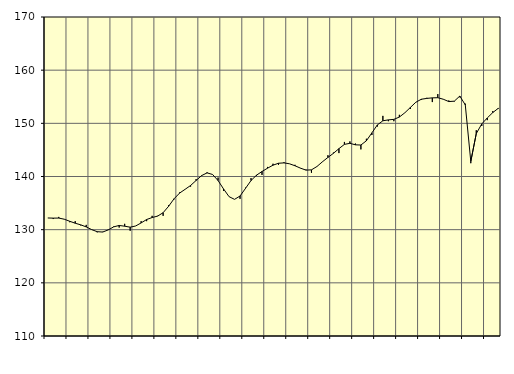
| Category | Piggar | Samtliga sysselsatta (inkl. sysselsatta utomlands)1 |
|---|---|---|
| nan | 132.2 | 132.2 |
| 1.0 | 132 | 132.17 |
| 1.0 | 132.4 | 132.18 |
| 1.0 | 132 | 131.97 |
| nan | 131.4 | 131.58 |
| 2.0 | 131.6 | 131.21 |
| 2.0 | 130.8 | 130.91 |
| 2.0 | 130.9 | 130.52 |
| nan | 130 | 130.01 |
| 3.0 | 129.5 | 129.62 |
| 3.0 | 129.6 | 129.55 |
| 3.0 | 130 | 129.95 |
| nan | 130.6 | 130.53 |
| 4.0 | 130.4 | 130.79 |
| 4.0 | 131.1 | 130.65 |
| 4.0 | 129.8 | 130.47 |
| nan | 130.7 | 130.69 |
| 5.0 | 131.6 | 131.27 |
| 5.0 | 131.6 | 131.91 |
| 5.0 | 132.6 | 132.28 |
| nan | 132.6 | 132.55 |
| 6.0 | 132.6 | 133.19 |
| 6.0 | 134.6 | 134.4 |
| 6.0 | 135.7 | 135.82 |
| nan | 137 | 136.88 |
| 7.0 | 137.6 | 137.59 |
| 7.0 | 138.1 | 138.31 |
| 7.0 | 139.5 | 139.25 |
| nan | 140.1 | 140.17 |
| 8.0 | 140.8 | 140.68 |
| 8.0 | 140.4 | 140.38 |
| 8.0 | 139.8 | 139.24 |
| nan | 137.3 | 137.66 |
| 9.0 | 136.2 | 136.21 |
| 9.0 | 135.7 | 135.7 |
| 9.0 | 135.8 | 136.33 |
| nan | 137.9 | 137.77 |
| 10.0 | 139.7 | 139.24 |
| 10.0 | 140.1 | 140.25 |
| 10.0 | 140.3 | 140.94 |
| nan | 141.8 | 141.56 |
| 11.0 | 142.4 | 142.13 |
| 11.0 | 142.2 | 142.49 |
| 11.0 | 142.7 | 142.56 |
| nan | 142.4 | 142.39 |
| 12.0 | 142.2 | 142.02 |
| 12.0 | 141.6 | 141.57 |
| 12.0 | 141.3 | 141.2 |
| nan | 140.7 | 141.25 |
| 13.0 | 141.9 | 141.88 |
| 13.0 | 142.8 | 142.77 |
| 13.0 | 144 | 143.59 |
| nan | 144.5 | 144.36 |
| 14.0 | 144.4 | 145.24 |
| 14.0 | 146.5 | 146.04 |
| 14.0 | 146.6 | 146.24 |
| nan | 146.2 | 145.96 |
| 15.0 | 145.1 | 145.92 |
| 15.0 | 147.1 | 146.72 |
| 15.0 | 147.8 | 148.21 |
| nan | 149.4 | 149.71 |
| 16.0 | 151.4 | 150.48 |
| 16.0 | 150.4 | 150.65 |
| 16.0 | 150.4 | 150.75 |
| nan | 151.6 | 151.18 |
| 17.0 | 152 | 151.99 |
| 17.0 | 152.7 | 152.98 |
| 17.0 | 154 | 153.97 |
| nan | 154.4 | 154.53 |
| 18.0 | 154.8 | 154.69 |
| 18.0 | 154 | 154.79 |
| 18.0 | 155.5 | 154.82 |
| nan | 154.5 | 154.53 |
| 19.0 | 154.3 | 154.09 |
| 19.0 | 154.1 | 154.17 |
| 19.0 | 154.9 | 155.13 |
| nan | 153.7 | 153.47 |
| 20.0 | 142.5 | 142.84 |
| 20.0 | 148.7 | 148.07 |
| 20.0 | 149.5 | 149.89 |
| nan | 150.6 | 151.01 |
| 21.0 | 152.3 | 152.02 |
| 21.0 | 152.7 | 152.82 |